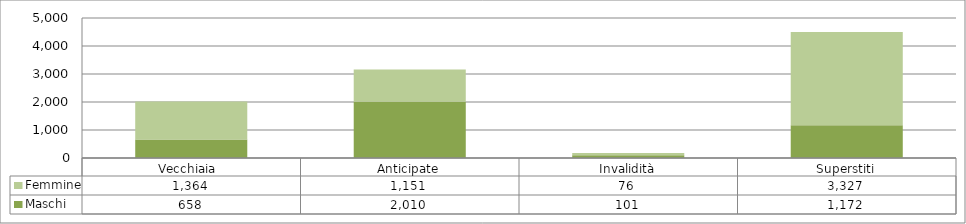
| Category | Maschi | Femmine |
|---|---|---|
| Vecchiaia  | 658 | 1364 |
| Anticipate | 2010 | 1151 |
| Invalidità | 101 | 76 |
| Superstiti | 1172 | 3327 |